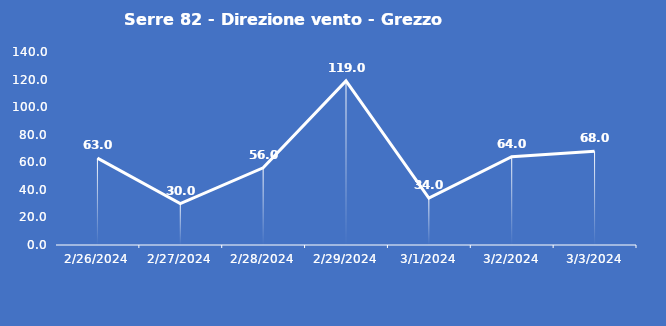
| Category | Serre 82 - Direzione vento - Grezzo (°N) |
|---|---|
| 2/26/24 | 63 |
| 2/27/24 | 30 |
| 2/28/24 | 56 |
| 2/29/24 | 119 |
| 3/1/24 | 34 |
| 3/2/24 | 64 |
| 3/3/24 | 68 |